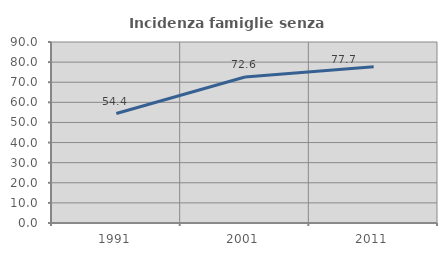
| Category | Incidenza famiglie senza nuclei |
|---|---|
| 1991.0 | 54.444 |
| 2001.0 | 72.619 |
| 2011.0 | 77.66 |